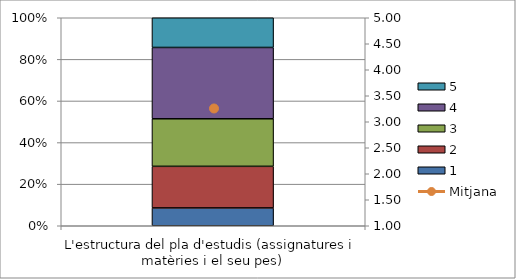
| Category | 1 | 2 | 3 | 4 | 5 |
|---|---|---|---|---|---|
| L'estructura del pla d'estudis (assignatures i matèries i el seu pes) | 3 | 7 | 8 | 12 | 5 |